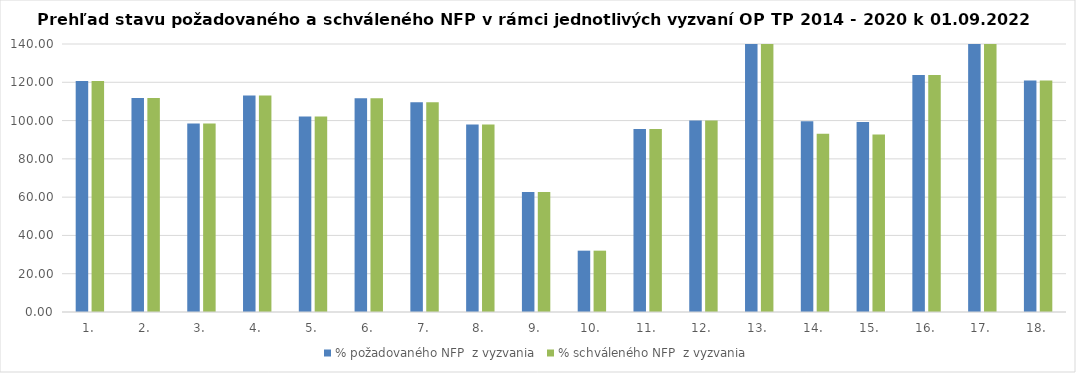
| Category | % požadovaného NFP  z vyzvania | % schváleného NFP  z vyzvania |
|---|---|---|
| 1. | 120.673 | 120.673 |
| 2. | 111.84 | 111.84 |
| 3. | 98.474 | 98.474 |
| 4. | 113.162 | 113.162 |
| 5. | 102.19 | 102.19 |
| 6. | 111.66 | 111.66 |
| 7. | 109.515 | 109.515 |
| 8. | 97.998 | 97.998 |
| 9. | 62.727 | 62.727 |
| 10. | 32.041 | 32.041 |
| 11. | 95.621 | 95.621 |
| 12. | 100.009 | 100.009 |
| 13. | 151.956 | 151.956 |
| 14. | 99.63 | 93.16 |
| 15. | 99.312 | 92.671 |
| 16. | 123.771 | 123.771 |
| 17. | 171.931 | 171.931 |
| 18. | 120.879 | 120.879 |